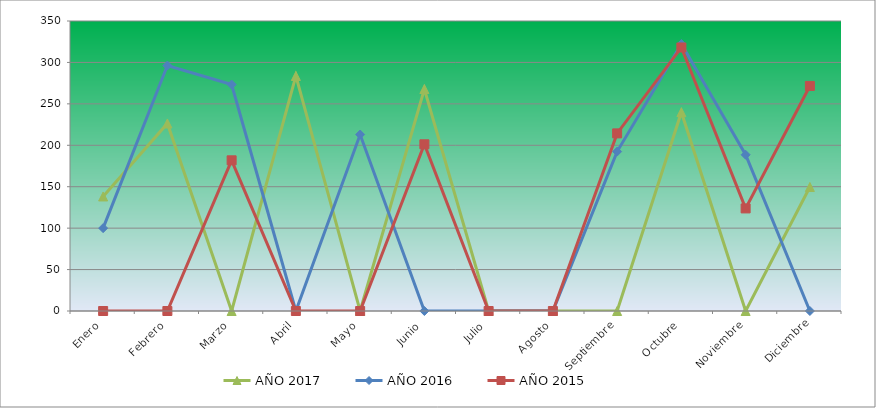
| Category | AÑO 2017 | AÑO 2016 | AÑO 2015 |
|---|---|---|---|
| Enero | 138.244 | 100.012 | 0 |
| Febrero | 226.347 | 296.22 | 0 |
| Marzo | 0 | 273.316 | 181.856 |
| Abril | 283.65 | 0 | 0 |
| Mayo | 0 | 213.003 | 0 |
| Junio | 267.892 | 0 | 201.202 |
| Julio | 0 | 0 | 0 |
| Agosto | 0 | 0 | 0 |
| Septiembre | 0 | 192.39 | 214.358 |
| Octubre | 239.956 | 322.177 | 318.055 |
| Noviembre | 0 | 188.573 | 123.817 |
| Diciembre | 149.704 | 0 | 271.623 |